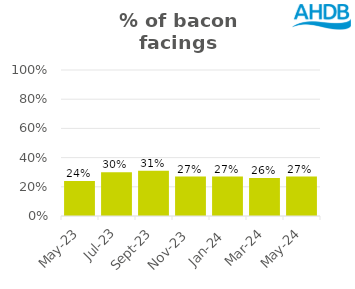
| Category | Bacon |
|---|---|
| 2023-05-01 | 0.24 |
| 2023-07-01 | 0.3 |
| 2023-09-01 | 0.31 |
| 2023-11-01 | 0.27 |
| 2024-01-01 | 0.27 |
| 2024-03-01 | 0.26 |
| 2024-05-01 | 0.27 |